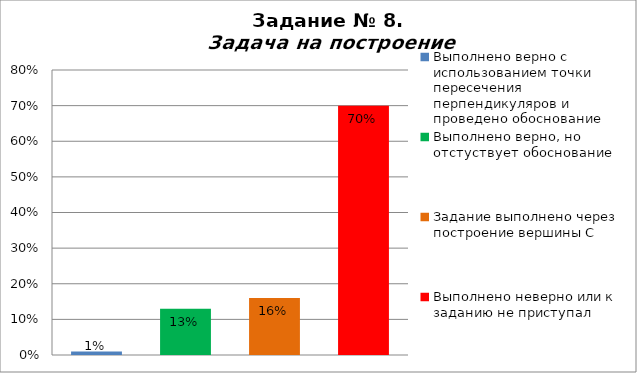
| Category | Задача на построение |
|---|---|
| Выполнено верно с использованием точки пересечения перпендикуляров и проведено обоснование | 0.01 |
| Выполнено верно, но отстуствует обоснование | 0.13 |
| Задание выполнено через построение вершины С | 0.16 |
| Выполнено неверно или к заданию не приступал | 0.7 |